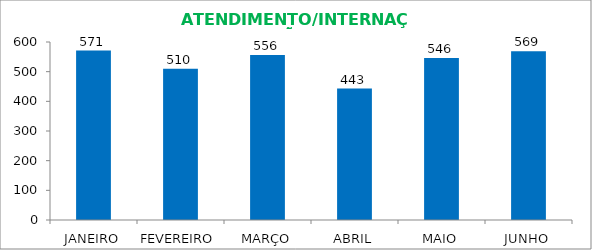
| Category | Series 0 |
|---|---|
| JANEIRO | 571 |
| FEVEREIRO | 510 |
| MARÇO | 556 |
| ABRIL | 443 |
| MAIO | 546 |
| JUNHO | 569 |